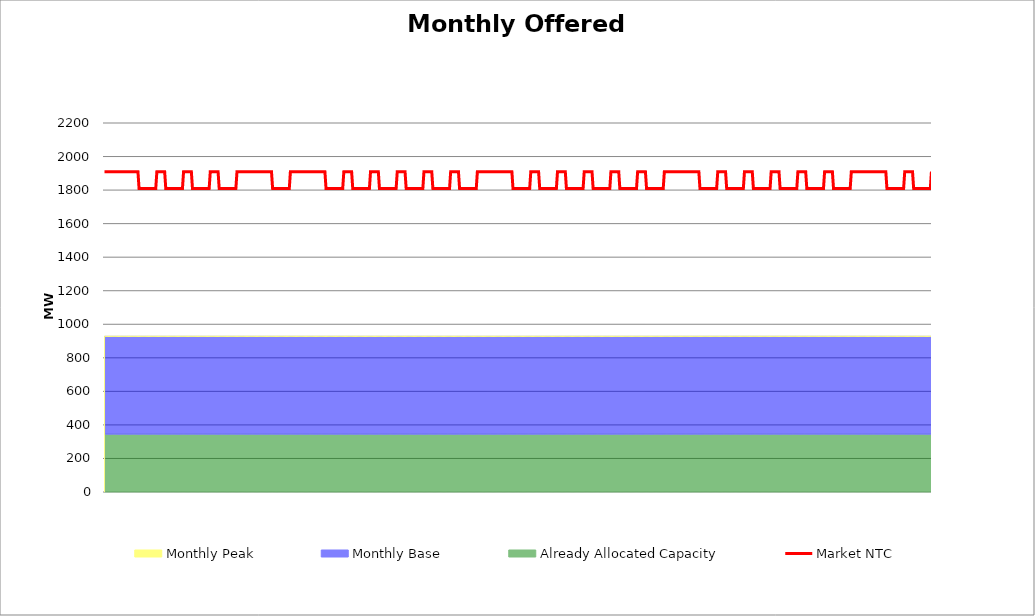
| Category | Market NTC |
|---|---|
| 0 | 1910 |
| 1 | 1910 |
| 2 | 1910 |
| 3 | 1910 |
| 4 | 1910 |
| 5 | 1910 |
| 6 | 1910 |
| 7 | 1910 |
| 8 | 1910 |
| 9 | 1910 |
| 10 | 1910 |
| 11 | 1910 |
| 12 | 1910 |
| 13 | 1910 |
| 14 | 1910 |
| 15 | 1910 |
| 16 | 1910 |
| 17 | 1910 |
| 18 | 1910 |
| 19 | 1910 |
| 20 | 1910 |
| 21 | 1910 |
| 22 | 1910 |
| 23 | 1910 |
| 24 | 1910 |
| 25 | 1910 |
| 26 | 1910 |
| 27 | 1910 |
| 28 | 1910 |
| 29 | 1910 |
| 30 | 1910 |
| 31 | 1810 |
| 32 | 1810 |
| 33 | 1810 |
| 34 | 1810 |
| 35 | 1810 |
| 36 | 1810 |
| 37 | 1810 |
| 38 | 1810 |
| 39 | 1810 |
| 40 | 1810 |
| 41 | 1810 |
| 42 | 1810 |
| 43 | 1810 |
| 44 | 1810 |
| 45 | 1810 |
| 46 | 1810 |
| 47 | 1910 |
| 48 | 1910 |
| 49 | 1910 |
| 50 | 1910 |
| 51 | 1910 |
| 52 | 1910 |
| 53 | 1910 |
| 54 | 1910 |
| 55 | 1810 |
| 56 | 1810 |
| 57 | 1810 |
| 58 | 1810 |
| 59 | 1810 |
| 60 | 1810 |
| 61 | 1810 |
| 62 | 1810 |
| 63 | 1810 |
| 64 | 1810 |
| 65 | 1810 |
| 66 | 1810 |
| 67 | 1810 |
| 68 | 1810 |
| 69 | 1810 |
| 70 | 1810 |
| 71 | 1910 |
| 72 | 1910 |
| 73 | 1910 |
| 74 | 1910 |
| 75 | 1910 |
| 76 | 1910 |
| 77 | 1910 |
| 78 | 1910 |
| 79 | 1810 |
| 80 | 1810 |
| 81 | 1810 |
| 82 | 1810 |
| 83 | 1810 |
| 84 | 1810 |
| 85 | 1810 |
| 86 | 1810 |
| 87 | 1810 |
| 88 | 1810 |
| 89 | 1810 |
| 90 | 1810 |
| 91 | 1810 |
| 92 | 1810 |
| 93 | 1810 |
| 94 | 1810 |
| 95 | 1910 |
| 96 | 1910 |
| 97 | 1910 |
| 98 | 1910 |
| 99 | 1910 |
| 100 | 1910 |
| 101 | 1910 |
| 102 | 1910 |
| 103 | 1810 |
| 104 | 1810 |
| 105 | 1810 |
| 106 | 1810 |
| 107 | 1810 |
| 108 | 1810 |
| 109 | 1810 |
| 110 | 1810 |
| 111 | 1810 |
| 112 | 1810 |
| 113 | 1810 |
| 114 | 1810 |
| 115 | 1810 |
| 116 | 1810 |
| 117 | 1810 |
| 118 | 1810 |
| 119 | 1910 |
| 120 | 1910 |
| 121 | 1910 |
| 122 | 1910 |
| 123 | 1910 |
| 124 | 1910 |
| 125 | 1910 |
| 126 | 1910 |
| 127 | 1910 |
| 128 | 1910 |
| 129 | 1910 |
| 130 | 1910 |
| 131 | 1910 |
| 132 | 1910 |
| 133 | 1910 |
| 134 | 1910 |
| 135 | 1910 |
| 136 | 1910 |
| 137 | 1910 |
| 138 | 1910 |
| 139 | 1910 |
| 140 | 1910 |
| 141 | 1910 |
| 142 | 1910 |
| 143 | 1910 |
| 144 | 1910 |
| 145 | 1910 |
| 146 | 1910 |
| 147 | 1910 |
| 148 | 1910 |
| 149 | 1910 |
| 150 | 1910 |
| 151 | 1810 |
| 152 | 1810 |
| 153 | 1810 |
| 154 | 1810 |
| 155 | 1810 |
| 156 | 1810 |
| 157 | 1810 |
| 158 | 1810 |
| 159 | 1810 |
| 160 | 1810 |
| 161 | 1810 |
| 162 | 1810 |
| 163 | 1810 |
| 164 | 1810 |
| 165 | 1810 |
| 166 | 1810 |
| 167 | 1910 |
| 168 | 1910 |
| 169 | 1910 |
| 170 | 1910 |
| 171 | 1910 |
| 172 | 1910 |
| 173 | 1910 |
| 174 | 1910 |
| 175 | 1910 |
| 176 | 1910 |
| 177 | 1910 |
| 178 | 1910 |
| 179 | 1910 |
| 180 | 1910 |
| 181 | 1910 |
| 182 | 1910 |
| 183 | 1910 |
| 184 | 1910 |
| 185 | 1910 |
| 186 | 1910 |
| 187 | 1910 |
| 188 | 1910 |
| 189 | 1910 |
| 190 | 1910 |
| 191 | 1910 |
| 192 | 1910 |
| 193 | 1910 |
| 194 | 1910 |
| 195 | 1910 |
| 196 | 1910 |
| 197 | 1910 |
| 198 | 1910 |
| 199 | 1810 |
| 200 | 1810 |
| 201 | 1810 |
| 202 | 1810 |
| 203 | 1810 |
| 204 | 1810 |
| 205 | 1810 |
| 206 | 1810 |
| 207 | 1810 |
| 208 | 1810 |
| 209 | 1810 |
| 210 | 1810 |
| 211 | 1810 |
| 212 | 1810 |
| 213 | 1810 |
| 214 | 1810 |
| 215 | 1910 |
| 216 | 1910 |
| 217 | 1910 |
| 218 | 1910 |
| 219 | 1910 |
| 220 | 1910 |
| 221 | 1910 |
| 222 | 1910 |
| 223 | 1810 |
| 224 | 1810 |
| 225 | 1810 |
| 226 | 1810 |
| 227 | 1810 |
| 228 | 1810 |
| 229 | 1810 |
| 230 | 1810 |
| 231 | 1810 |
| 232 | 1810 |
| 233 | 1810 |
| 234 | 1810 |
| 235 | 1810 |
| 236 | 1810 |
| 237 | 1810 |
| 238 | 1810 |
| 239 | 1910 |
| 240 | 1910 |
| 241 | 1910 |
| 242 | 1910 |
| 243 | 1910 |
| 244 | 1910 |
| 245 | 1910 |
| 246 | 1910 |
| 247 | 1810 |
| 248 | 1810 |
| 249 | 1810 |
| 250 | 1810 |
| 251 | 1810 |
| 252 | 1810 |
| 253 | 1810 |
| 254 | 1810 |
| 255 | 1810 |
| 256 | 1810 |
| 257 | 1810 |
| 258 | 1810 |
| 259 | 1810 |
| 260 | 1810 |
| 261 | 1810 |
| 262 | 1810 |
| 263 | 1910 |
| 264 | 1910 |
| 265 | 1910 |
| 266 | 1910 |
| 267 | 1910 |
| 268 | 1910 |
| 269 | 1910 |
| 270 | 1910 |
| 271 | 1810 |
| 272 | 1810 |
| 273 | 1810 |
| 274 | 1810 |
| 275 | 1810 |
| 276 | 1810 |
| 277 | 1810 |
| 278 | 1810 |
| 279 | 1810 |
| 280 | 1810 |
| 281 | 1810 |
| 282 | 1810 |
| 283 | 1810 |
| 284 | 1810 |
| 285 | 1810 |
| 286 | 1810 |
| 287 | 1910 |
| 288 | 1910 |
| 289 | 1910 |
| 290 | 1910 |
| 291 | 1910 |
| 292 | 1910 |
| 293 | 1910 |
| 294 | 1910 |
| 295 | 1810 |
| 296 | 1810 |
| 297 | 1810 |
| 298 | 1810 |
| 299 | 1810 |
| 300 | 1810 |
| 301 | 1810 |
| 302 | 1810 |
| 303 | 1810 |
| 304 | 1810 |
| 305 | 1810 |
| 306 | 1810 |
| 307 | 1810 |
| 308 | 1810 |
| 309 | 1810 |
| 310 | 1810 |
| 311 | 1910 |
| 312 | 1910 |
| 313 | 1910 |
| 314 | 1910 |
| 315 | 1910 |
| 316 | 1910 |
| 317 | 1910 |
| 318 | 1910 |
| 319 | 1810 |
| 320 | 1810 |
| 321 | 1810 |
| 322 | 1810 |
| 323 | 1810 |
| 324 | 1810 |
| 325 | 1810 |
| 326 | 1810 |
| 327 | 1810 |
| 328 | 1810 |
| 329 | 1810 |
| 330 | 1810 |
| 331 | 1810 |
| 332 | 1810 |
| 333 | 1810 |
| 334 | 1810 |
| 335 | 1910 |
| 336 | 1910 |
| 337 | 1910 |
| 338 | 1910 |
| 339 | 1910 |
| 340 | 1910 |
| 341 | 1910 |
| 342 | 1910 |
| 343 | 1910 |
| 344 | 1910 |
| 345 | 1910 |
| 346 | 1910 |
| 347 | 1910 |
| 348 | 1910 |
| 349 | 1910 |
| 350 | 1910 |
| 351 | 1910 |
| 352 | 1910 |
| 353 | 1910 |
| 354 | 1910 |
| 355 | 1910 |
| 356 | 1910 |
| 357 | 1910 |
| 358 | 1910 |
| 359 | 1910 |
| 360 | 1910 |
| 361 | 1910 |
| 362 | 1910 |
| 363 | 1910 |
| 364 | 1910 |
| 365 | 1910 |
| 366 | 1910 |
| 367 | 1810 |
| 368 | 1810 |
| 369 | 1810 |
| 370 | 1810 |
| 371 | 1810 |
| 372 | 1810 |
| 373 | 1810 |
| 374 | 1810 |
| 375 | 1810 |
| 376 | 1810 |
| 377 | 1810 |
| 378 | 1810 |
| 379 | 1810 |
| 380 | 1810 |
| 381 | 1810 |
| 382 | 1810 |
| 383 | 1910 |
| 384 | 1910 |
| 385 | 1910 |
| 386 | 1910 |
| 387 | 1910 |
| 388 | 1910 |
| 389 | 1910 |
| 390 | 1910 |
| 391 | 1810 |
| 392 | 1810 |
| 393 | 1810 |
| 394 | 1810 |
| 395 | 1810 |
| 396 | 1810 |
| 397 | 1810 |
| 398 | 1810 |
| 399 | 1810 |
| 400 | 1810 |
| 401 | 1810 |
| 402 | 1810 |
| 403 | 1810 |
| 404 | 1810 |
| 405 | 1810 |
| 406 | 1810 |
| 407 | 1910 |
| 408 | 1910 |
| 409 | 1910 |
| 410 | 1910 |
| 411 | 1910 |
| 412 | 1910 |
| 413 | 1910 |
| 414 | 1910 |
| 415 | 1810 |
| 416 | 1810 |
| 417 | 1810 |
| 418 | 1810 |
| 419 | 1810 |
| 420 | 1810 |
| 421 | 1810 |
| 422 | 1810 |
| 423 | 1810 |
| 424 | 1810 |
| 425 | 1810 |
| 426 | 1810 |
| 427 | 1810 |
| 428 | 1810 |
| 429 | 1810 |
| 430 | 1810 |
| 431 | 1910 |
| 432 | 1910 |
| 433 | 1910 |
| 434 | 1910 |
| 435 | 1910 |
| 436 | 1910 |
| 437 | 1910 |
| 438 | 1910 |
| 439 | 1810 |
| 440 | 1810 |
| 441 | 1810 |
| 442 | 1810 |
| 443 | 1810 |
| 444 | 1810 |
| 445 | 1810 |
| 446 | 1810 |
| 447 | 1810 |
| 448 | 1810 |
| 449 | 1810 |
| 450 | 1810 |
| 451 | 1810 |
| 452 | 1810 |
| 453 | 1810 |
| 454 | 1810 |
| 455 | 1910 |
| 456 | 1910 |
| 457 | 1910 |
| 458 | 1910 |
| 459 | 1910 |
| 460 | 1910 |
| 461 | 1910 |
| 462 | 1910 |
| 463 | 1810 |
| 464 | 1810 |
| 465 | 1810 |
| 466 | 1810 |
| 467 | 1810 |
| 468 | 1810 |
| 469 | 1810 |
| 470 | 1810 |
| 471 | 1810 |
| 472 | 1810 |
| 473 | 1810 |
| 474 | 1810 |
| 475 | 1810 |
| 476 | 1810 |
| 477 | 1810 |
| 478 | 1810 |
| 479 | 1910 |
| 480 | 1910 |
| 481 | 1910 |
| 482 | 1910 |
| 483 | 1910 |
| 484 | 1910 |
| 485 | 1910 |
| 486 | 1910 |
| 487 | 1810 |
| 488 | 1810 |
| 489 | 1810 |
| 490 | 1810 |
| 491 | 1810 |
| 492 | 1810 |
| 493 | 1810 |
| 494 | 1810 |
| 495 | 1810 |
| 496 | 1810 |
| 497 | 1810 |
| 498 | 1810 |
| 499 | 1810 |
| 500 | 1810 |
| 501 | 1810 |
| 502 | 1810 |
| 503 | 1910 |
| 504 | 1910 |
| 505 | 1910 |
| 506 | 1910 |
| 507 | 1910 |
| 508 | 1910 |
| 509 | 1910 |
| 510 | 1910 |
| 511 | 1910 |
| 512 | 1910 |
| 513 | 1910 |
| 514 | 1910 |
| 515 | 1910 |
| 516 | 1910 |
| 517 | 1910 |
| 518 | 1910 |
| 519 | 1910 |
| 520 | 1910 |
| 521 | 1910 |
| 522 | 1910 |
| 523 | 1910 |
| 524 | 1910 |
| 525 | 1910 |
| 526 | 1910 |
| 527 | 1910 |
| 528 | 1910 |
| 529 | 1910 |
| 530 | 1910 |
| 531 | 1910 |
| 532 | 1910 |
| 533 | 1910 |
| 534 | 1910 |
| 535 | 1810 |
| 536 | 1810 |
| 537 | 1810 |
| 538 | 1810 |
| 539 | 1810 |
| 540 | 1810 |
| 541 | 1810 |
| 542 | 1810 |
| 543 | 1810 |
| 544 | 1810 |
| 545 | 1810 |
| 546 | 1810 |
| 547 | 1810 |
| 548 | 1810 |
| 549 | 1810 |
| 550 | 1810 |
| 551 | 1910 |
| 552 | 1910 |
| 553 | 1910 |
| 554 | 1910 |
| 555 | 1910 |
| 556 | 1910 |
| 557 | 1910 |
| 558 | 1910 |
| 559 | 1810 |
| 560 | 1810 |
| 561 | 1810 |
| 562 | 1810 |
| 563 | 1810 |
| 564 | 1810 |
| 565 | 1810 |
| 566 | 1810 |
| 567 | 1810 |
| 568 | 1810 |
| 569 | 1810 |
| 570 | 1810 |
| 571 | 1810 |
| 572 | 1810 |
| 573 | 1810 |
| 574 | 1810 |
| 575 | 1910 |
| 576 | 1910 |
| 577 | 1910 |
| 578 | 1910 |
| 579 | 1910 |
| 580 | 1910 |
| 581 | 1910 |
| 582 | 1910 |
| 583 | 1810 |
| 584 | 1810 |
| 585 | 1810 |
| 586 | 1810 |
| 587 | 1810 |
| 588 | 1810 |
| 589 | 1810 |
| 590 | 1810 |
| 591 | 1810 |
| 592 | 1810 |
| 593 | 1810 |
| 594 | 1810 |
| 595 | 1810 |
| 596 | 1810 |
| 597 | 1810 |
| 598 | 1810 |
| 599 | 1910 |
| 600 | 1910 |
| 601 | 1910 |
| 602 | 1910 |
| 603 | 1910 |
| 604 | 1910 |
| 605 | 1910 |
| 606 | 1910 |
| 607 | 1810 |
| 608 | 1810 |
| 609 | 1810 |
| 610 | 1810 |
| 611 | 1810 |
| 612 | 1810 |
| 613 | 1810 |
| 614 | 1810 |
| 615 | 1810 |
| 616 | 1810 |
| 617 | 1810 |
| 618 | 1810 |
| 619 | 1810 |
| 620 | 1810 |
| 621 | 1810 |
| 622 | 1810 |
| 623 | 1910 |
| 624 | 1910 |
| 625 | 1910 |
| 626 | 1910 |
| 627 | 1910 |
| 628 | 1910 |
| 629 | 1910 |
| 630 | 1910 |
| 631 | 1810 |
| 632 | 1810 |
| 633 | 1810 |
| 634 | 1810 |
| 635 | 1810 |
| 636 | 1810 |
| 637 | 1810 |
| 638 | 1810 |
| 639 | 1810 |
| 640 | 1810 |
| 641 | 1810 |
| 642 | 1810 |
| 643 | 1810 |
| 644 | 1810 |
| 645 | 1810 |
| 646 | 1810 |
| 647 | 1910 |
| 648 | 1910 |
| 649 | 1910 |
| 650 | 1910 |
| 651 | 1910 |
| 652 | 1910 |
| 653 | 1910 |
| 654 | 1910 |
| 655 | 1810 |
| 656 | 1810 |
| 657 | 1810 |
| 658 | 1810 |
| 659 | 1810 |
| 660 | 1810 |
| 661 | 1810 |
| 662 | 1810 |
| 663 | 1810 |
| 664 | 1810 |
| 665 | 1810 |
| 666 | 1810 |
| 667 | 1810 |
| 668 | 1810 |
| 669 | 1810 |
| 670 | 1810 |
| 671 | 1910 |
| 672 | 1910 |
| 673 | 1910 |
| 674 | 1910 |
| 675 | 1910 |
| 676 | 1910 |
| 677 | 1910 |
| 678 | 1910 |
| 679 | 1910 |
| 680 | 1910 |
| 681 | 1910 |
| 682 | 1910 |
| 683 | 1910 |
| 684 | 1910 |
| 685 | 1910 |
| 686 | 1910 |
| 687 | 1910 |
| 688 | 1910 |
| 689 | 1910 |
| 690 | 1910 |
| 691 | 1910 |
| 692 | 1910 |
| 693 | 1910 |
| 694 | 1910 |
| 695 | 1910 |
| 696 | 1910 |
| 697 | 1910 |
| 698 | 1910 |
| 699 | 1910 |
| 700 | 1910 |
| 701 | 1910 |
| 702 | 1910 |
| 703 | 1810 |
| 704 | 1810 |
| 705 | 1810 |
| 706 | 1810 |
| 707 | 1810 |
| 708 | 1810 |
| 709 | 1810 |
| 710 | 1810 |
| 711 | 1810 |
| 712 | 1810 |
| 713 | 1810 |
| 714 | 1810 |
| 715 | 1810 |
| 716 | 1810 |
| 717 | 1810 |
| 718 | 1810 |
| 719 | 1910 |
| 720 | 1910 |
| 721 | 1910 |
| 722 | 1910 |
| 723 | 1910 |
| 724 | 1910 |
| 725 | 1910 |
| 726 | 1910 |
| 727 | 1810 |
| 728 | 1810 |
| 729 | 1810 |
| 730 | 1810 |
| 731 | 1810 |
| 732 | 1810 |
| 733 | 1810 |
| 734 | 1810 |
| 735 | 1810 |
| 736 | 1810 |
| 737 | 1810 |
| 738 | 1810 |
| 739 | 1810 |
| 740 | 1810 |
| 741 | 1810 |
| 742 | 1810 |
| 743 | 1910 |